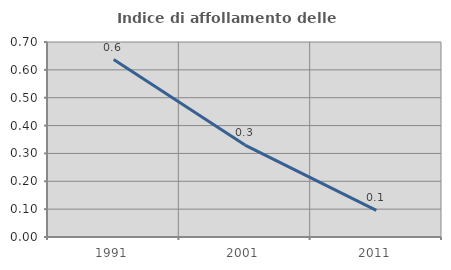
| Category | Indice di affollamento delle abitazioni  |
|---|---|
| 1991.0 | 0.637 |
| 2001.0 | 0.33 |
| 2011.0 | 0.095 |